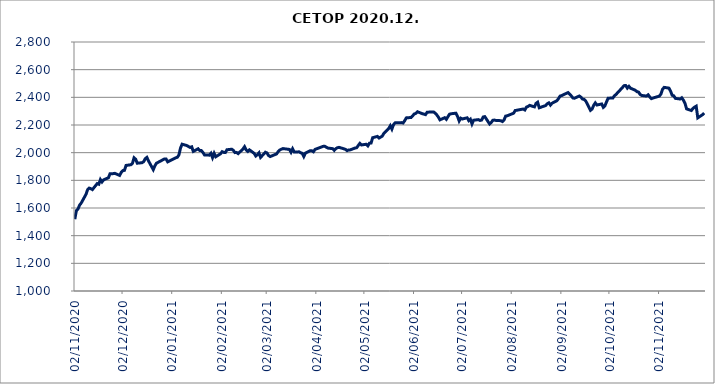
| Category | CETOP |
|---|---|
| 02/11/2020 | 1519.19 |
| 03/11/2020 | 1581.46 |
| 04/11/2020 | 1593.28 |
| 05/11/2020 | 1620.79 |
| 06/11/2020 | 1635.85 |
| 09/11/2020 | 1699.08 |
| 10/11/2020 | 1732.26 |
| 11/11/2020 | 1743.66 |
| 12/11/2020 | 1739.7 |
| 13/11/2020 | 1733.07 |
| 16/11/2020 | 1776.66 |
| 17/11/2020 | 1772.01 |
| 18/11/2020 | 1805.8 |
| 19/11/2020 | 1788.54 |
| 20/11/2020 | 1803.8 |
| 23/11/2020 | 1818.56 |
| 24/11/2020 | 1848.16 |
| 25/11/2020 | 1847.99 |
| 26/11/2020 | 1848.47 |
| 27/11/2020 | 1850.47 |
| 30/11/2020 | 1835.59 |
| 01/12/2020 | 1857.61 |
| 02/12/2020 | 1870.38 |
| 03/12/2020 | 1871.91 |
| 04/12/2020 | 1907.87 |
| 07/12/2020 | 1912.65 |
| 08/12/2020 | 1922.85 |
| 09/12/2020 | 1962.8 |
| 10/12/2020 | 1952.45 |
| 11/12/2020 | 1923.82 |
| 14/12/2020 | 1927.53 |
| 15/12/2020 | 1935.14 |
| 16/12/2020 | 1956.56 |
| 17/12/2020 | 1965.92 |
| 18/12/2020 | 1940.88 |
| 21/12/2020 | 1877.07 |
| 22/12/2020 | 1904.82 |
| 23/12/2020 | 1923.84 |
| 28/12/2020 | 1954.78 |
| 29/12/2020 | 1954.29 |
| 30/12/2020 | 1933.266 |
| 04/01/2021 | 1962.73 |
| 05/01/2021 | 1966.43 |
| 06/01/2021 | 1983.41 |
| 07/01/2021 | 2033.28 |
| 08/01/2021 | 2061.34 |
| 11/01/2021 | 2051.33 |
| 12/01/2021 | 2044.47 |
| 13/01/2021 | 2037.86 |
| 14/01/2021 | 2042.29 |
| 15/01/2021 | 2009.01 |
| 18/01/2021 | 2028.23 |
| 19/01/2021 | 2015.22 |
| 20/01/2021 | 2015.5 |
| 21/01/2021 | 2001.38 |
| 22/01/2021 | 1983.77 |
| 25/01/2021 | 1982.05 |
| 26/01/2021 | 1995.48 |
| 27/01/2021 | 1964.21 |
| 28/01/2021 | 1995.54 |
| 29/01/2021 | 1970.38 |
| 01/02/2021 | 1991.99 |
| 02/02/2021 | 2007.22 |
| 03/02/2021 | 2001.98 |
| 04/02/2021 | 2000.87 |
| 05/02/2021 | 2021.06 |
| 08/02/2021 | 2024.95 |
| 09/02/2021 | 2016.39 |
| 10/02/2021 | 2000.46 |
| 11/02/2021 | 2001.9 |
| 12/02/2021 | 1993.13 |
| 15/02/2021 | 2026.16 |
| 16/02/2021 | 2043.11 |
| 17/02/2021 | 2019.49 |
| 18/02/2021 | 2009.18 |
| 19/02/2021 | 2020.59 |
| 22/02/2021 | 1995 |
| 23/02/2021 | 1975.92 |
| 24/02/2021 | 1985.63 |
| 25/02/2021 | 1998.97 |
| 26/02/2021 | 1965.68 |
| 01/03/2021 | 2003.02 |
| 02/03/2021 | 1998.07 |
| 03/03/2021 | 1979.09 |
| 04/03/2021 | 1971.77 |
| 05/03/2021 | 1976.6 |
| 08/03/2021 | 1990.9 |
| 09/03/2021 | 2008.59 |
| 10/03/2021 | 2019.29 |
| 11/03/2021 | 2025.26 |
| 12/03/2021 | 2029.51 |
| 16/03/2021 | 2023.5 |
| 17/03/2021 | 2003.29 |
| 18/03/2021 | 2028.11 |
| 19/03/2021 | 2004.22 |
| 22/03/2021 | 2006.02 |
| 23/03/2021 | 1999.63 |
| 24/03/2021 | 1995.8 |
| 25/03/2021 | 1972.27 |
| 26/03/2021 | 1997.05 |
| 29/03/2021 | 2014.18 |
| 30/03/2021 | 2013.83 |
| 31/03/2021 | 2006.45 |
| 01/04/2021 | 2023.58 |
| 06/04/2021 | 2045.4 |
| 07/04/2021 | 2046.41 |
| 08/04/2021 | 2039.84 |
| 09/04/2021 | 2033.25 |
| 12/04/2021 | 2028.9 |
| 13/04/2021 | 2016.66 |
| 14/04/2021 | 2029.14 |
| 15/04/2021 | 2035.89 |
| 16/04/2021 | 2038.42 |
| 19/04/2021 | 2028.01 |
| 20/04/2021 | 2024 |
| 21/04/2021 | 2014.62 |
| 22/04/2021 | 2019.58 |
| 23/04/2021 | 2020.23 |
| 26/04/2021 | 2033.61 |
| 27/04/2021 | 2035.8 |
| 28/04/2021 | 2052.04 |
| 29/04/2021 | 2067.11 |
| 30/04/2021 | 2055.6 |
| 03/05/2021 | 2061.01 |
| 04/05/2021 | 2049.53 |
| 05/05/2021 | 2068.79 |
| 06/05/2021 | 2069.54 |
| 07/05/2021 | 2108.14 |
| 10/05/2021 | 2117.62 |
| 11/05/2021 | 2105.93 |
| 12/05/2021 | 2112.74 |
| 13/05/2021 | 2119.92 |
| 14/05/2021 | 2139.97 |
| 17/05/2021 | 2174.57 |
| 18/05/2021 | 2194.7 |
| 19/05/2021 | 2170.62 |
| 20/05/2021 | 2202.26 |
| 21/05/2021 | 2215.55 |
| 25/05/2021 | 2217.23 |
| 26/05/2021 | 2214.13 |
| 27/05/2021 | 2231.31 |
| 28/05/2021 | 2251.68 |
| 31/05/2021 | 2254.36 |
| 01/06/2021 | 2267.05 |
| 02/06/2021 | 2280.22 |
| 03/06/2021 | 2284.16 |
| 04/06/2021 | 2295.68 |
| 07/06/2021 | 2281.71 |
| 08/06/2021 | 2278.76 |
| 09/06/2021 | 2274.78 |
| 10/06/2021 | 2292.52 |
| 11/06/2021 | 2293.04 |
| 14/06/2021 | 2294.68 |
| 15/06/2021 | 2286.29 |
| 16/06/2021 | 2273.35 |
| 17/06/2021 | 2257.3 |
| 18/06/2021 | 2237.18 |
| 21/06/2021 | 2253.1 |
| 22/06/2021 | 2241.35 |
| 23/06/2021 | 2260.73 |
| 24/06/2021 | 2278.2 |
| 25/06/2021 | 2281.37 |
| 28/06/2021 | 2285.26 |
| 29/06/2021 | 2261.99 |
| 30/06/2021 | 2229.26 |
| 01/07/2021 | 2249.46 |
| 02/07/2021 | 2243.67 |
| 05/07/2021 | 2252.04 |
| 06/07/2021 | 2231.68 |
| 07/07/2021 | 2241.97 |
| 08/07/2021 | 2207.81 |
| 09/07/2021 | 2234.45 |
| 12/07/2021 | 2238.84 |
| 13/07/2021 | 2232.86 |
| 14/07/2021 | 2235.51 |
| 15/07/2021 | 2257.74 |
| 16/07/2021 | 2260.51 |
| 19/07/2021 | 2207.64 |
| 20/07/2021 | 2217.89 |
| 21/07/2021 | 2233.92 |
| 22/07/2021 | 2235.73 |
| 23/07/2021 | 2232.84 |
| 26/07/2021 | 2231.29 |
| 27/07/2021 | 2225.16 |
| 28/07/2021 | 2235.92 |
| 29/07/2021 | 2264.07 |
| 30/07/2021 | 2266.62 |
| 02/08/2021 | 2280.58 |
| 03/08/2021 | 2285.5 |
| 04/08/2021 | 2304.99 |
| 05/08/2021 | 2306.32 |
| 06/08/2021 | 2309.02 |
| 09/08/2021 | 2315.44 |
| 10/08/2021 | 2308.61 |
| 11/08/2021 | 2329.15 |
| 12/08/2021 | 2334.42 |
| 13/08/2021 | 2341.91 |
| 16/08/2021 | 2330.99 |
| 17/08/2021 | 2356.38 |
| 18/08/2021 | 2364.72 |
| 19/08/2021 | 2324.29 |
| 23/08/2021 | 2340.76 |
| 24/08/2021 | 2353.36 |
| 25/08/2021 | 2360.03 |
| 26/08/2021 | 2343.94 |
| 27/08/2021 | 2357.33 |
| 30/08/2021 | 2375.41 |
| 31/08/2021 | 2390.41 |
| 01/09/2021 | 2408.72 |
| 02/09/2021 | 2412.64 |
| 03/09/2021 | 2418.55 |
| 06/09/2021 | 2434.27 |
| 07/09/2021 | 2423.33 |
| 08/09/2021 | 2410.33 |
| 09/09/2021 | 2395.53 |
| 10/09/2021 | 2393.5 |
| 13/09/2021 | 2409.5 |
| 14/09/2021 | 2401.55 |
| 15/09/2021 | 2387.77 |
| 16/09/2021 | 2385.41 |
| 17/09/2021 | 2374.54 |
| 20/09/2021 | 2305.89 |
| 21/09/2021 | 2315.21 |
| 22/09/2021 | 2342.42 |
| 23/09/2021 | 2359.97 |
| 24/09/2021 | 2344.48 |
| 27/09/2021 | 2351.98 |
| 28/09/2021 | 2327.67 |
| 29/09/2021 | 2338.97 |
| 30/09/2021 | 2366.72 |
| 01/10/2021 | 2393.57 |
| 04/10/2021 | 2395.65 |
| 05/10/2021 | 2412.26 |
| 06/10/2021 | 2420.8 |
| 07/10/2021 | 2435.1 |
| 08/10/2021 | 2446.44 |
| 11/10/2021 | 2484.56 |
| 12/10/2021 | 2485.3 |
| 13/10/2021 | 2466.98 |
| 14/10/2021 | 2479.55 |
| 15/10/2021 | 2465.98 |
| 18/10/2021 | 2451.12 |
| 19/10/2021 | 2440.7 |
| 20/10/2021 | 2438.13 |
| 21/10/2021 | 2420.78 |
| 22/10/2021 | 2413.74 |
| 25/10/2021 | 2409.22 |
| 26/10/2021 | 2418.34 |
| 27/10/2021 | 2403.14 |
| 28/10/2021 | 2390.55 |
| 29/10/2021 | 2394.99 |
| 02/11/2021 | 2408.72 |
| 03/11/2021 | 2424.17 |
| 04/11/2021 | 2458.38 |
| 05/11/2021 | 2472.04 |
| 08/11/2021 | 2466.46 |
| 09/11/2021 | 2444.82 |
| 10/11/2021 | 2415.2 |
| 11/11/2021 | 2410.85 |
| 12/11/2021 | 2392.43 |
| 15/11/2021 | 2387.91 |
| 16/11/2021 | 2396.61 |
| 17/11/2021 | 2380.24 |
| 18/11/2021 | 2357.21 |
| 19/11/2021 | 2316.67 |
| 22/11/2021 | 2304.75 |
| 23/11/2021 | 2320.13 |
| 24/11/2021 | 2329.46 |
| 25/11/2021 | 2336.06 |
| 26/11/2021 | 2251.73 |
| 29/11/2021 | 2274.83 |
| 30/11/2021 | 2286.44 |